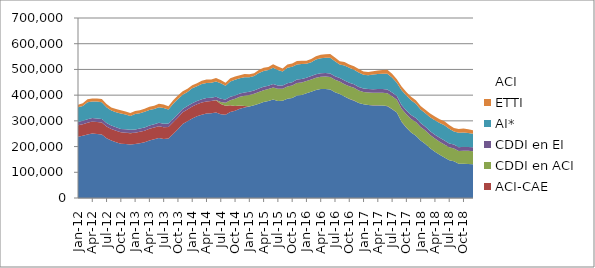
| Category | Contrat aidés hors IAE | ACI-CAE | CDDI en ACI | CDDI en EI | AI* | ETTI | ACI |
|---|---|---|---|---|---|---|---|
| 2012-01-01 | 237790 | 44843 | 7 | 13194 | 56827 | 10405 | 44850 |
| 2012-02-01 | 242077 | 45181 | 7 | 13142 | 57340 | 10618 | 45188 |
| 2012-03-01 | 246800 | 45648 | 8 | 13343 | 66093 | 11906 | 45656 |
| 2012-04-01 | 250997 | 46293 | 9 | 13502 | 64489 | 12020 | 46302 |
| 2012-05-01 | 249017 | 46345 | 11 | 13611 | 65988 | 12019 | 46356 |
| 2012-06-01 | 247269 | 46280 | 11 | 13730 | 65047 | 13131 | 46291 |
| 2012-07-01 | 232493 | 45627 | 12 | 13729 | 60846 | 13000 | 45639 |
| 2012-08-01 | 223835 | 44692 | 14 | 13555 | 58655 | 11536 | 44706 |
| 2012-09-01 | 216950 | 44370 | 17 | 13399 | 59007 | 12350 | 44387 |
| 2012-10-01 | 211000 | 44238 | 18 | 13380 | 59663 | 12602 | 44256 |
| 2012-11-01 | 209535 | 44428 | 23 | 13281 | 56994 | 12270 | 44451 |
| 2012-12-01 | 208190 | 44096 | 24 | 13060 | 53786 | 11784 | 44120 |
| 2013-01-01 | 209747 | 43795 | 34 | 12834 | 60509 | 11172 | 43829 |
| 2013-02-01 | 213206 | 44415 | 40 | 12826 | 59116 | 11595 | 44455 |
| 2013-03-01 | 216511 | 44786 | 54 | 12681 | 61223 | 12202 | 44840 |
| 2013-04-01 | 223618 | 45337 | 71 | 12829 | 60623 | 12795 | 45408 |
| 2013-05-01 | 228250 | 45591 | 82 | 12848 | 59330 | 12809 | 45673 |
| 2013-06-01 | 233109 | 46085 | 93 | 13026 | 61038 | 13410 | 46178 |
| 2013-07-01 | 229386 | 45979 | 111 | 13146 | 61170 | 14219 | 46090 |
| 2013-08-01 | 230945 | 45303 | 130 | 12918 | 54934 | 12388 | 45433 |
| 2013-09-01 | 249297 | 45329 | 171 | 12930 | 58926 | 13414 | 45500 |
| 2013-10-01 | 267700 | 45524 | 205 | 12967 | 58252 | 13732 | 45729 |
| 2013-11-01 | 287393 | 46081 | 252 | 12853 | 55422 | 12910 | 46333 |
| 2013-12-01 | 298220 | 45998 | 293 | 12821 | 55158 | 12575 | 46291 |
| 2014-01-01 | 309464 | 45928 | 308 | 12621 | 58696.797 | 11478 | 46236 |
| 2014-02-01 | 318114 | 46338 | 306 | 12626 | 57345.516 | 11258 | 46644 |
| 2014-03-01 | 324218 | 46693 | 313 | 12719 | 59389.413 | 12354 | 47006 |
| 2014-04-01 | 328255 | 47122 | 315 | 12914 | 58807.382 | 12977 | 47437 |
| 2014-05-01 | 329929 | 47121 | 302 | 12956 | 57553.107 | 12548 | 47423 |
| 2014-06-01 | 332124 | 48488 | 318 | 13239 | 59209.953 | 13420 | 48806 |
| 2014-07-01 | 325464 | 40457 | 6940 | 13160 | 59964 | 13345 | 47397 |
| 2014-08-01 | 324035 | 34754 | 11660 | 12925 | 53350 | 11352 | 46414 |
| 2014-09-01 | 334111 | 27006 | 19338 | 13025 | 59881 | 12517 | 46344 |
| 2014-10-01 | 338973 | 19225 | 27417 | 13017 | 61270 | 12452 | 46642 |
| 2014-11-01 | 346780 | 12975 | 33878 | 12914 | 58983 | 11655 | 46853 |
| 2014-12-01 | 351822 | 6151 | 39589 | 12825 | 59612 | 11767 | 45740 |
| 2015-01-01 | 356102 | 42 | 44848 | 12679 | 56326 | 10779 | 44890 |
| 2015-02-01 | 360232 | 14 | 45282 | 12631 | 55861 | 11126 | 45296 |
| 2015-03-01 | 366449 | 7 | 46062 | 12836 | 60557 | 12000 | 46069 |
| 2015-04-01 | 372869 | 4 | 46551 | 13017 | 61199 | 12554 | 46555 |
| 2015-05-01 | 376997 | 2 | 46659 | 13065 | 60705 | 12297 | 46661 |
| 2015-06-01 | 382662 | 2 | 47282 | 13391 | 62866 | 13518 | 47284 |
| 2015-07-01 | 377401 | 0 | 47007 | 13324 | 60259 | 13458 | 47007 |
| 2015-08-01 | 377988 | 0 | 46597 | 13160 | 53778 | 11609 | 46597 |
| 2015-09-01 | 385526 | 0 | 47696 | 13210 | 60301 | 12751 | 47696 |
| 2015-10-01 | 388858 | 0 | 48336 | 13149 | 59696 | 13129 | 48336 |
| 2015-11-01 | 398394 | 0 | 48919 | 13239 | 58958 | 12795 | 48919 |
| 2015-12-01 | 400899 | 0 | 48471 | 13046 | 59158 | 12273 | 48471 |
| 2016-01-01 | 407505 | 0 | 47593 | 12880 | 54191 | 11102 | 47593 |
| 2016-02-01 | 413425 | 123 | 47606 | 12906 | 54239 | 11853 | 47729 |
| 2016-03-01 | 420027 | 125 | 47900 | 13201 | 57281 | 12601 | 48025 |
| 2016-04-01 | 423598 | 123 | 48128 | 13312 | 58553 | 13016 | 48251 |
| 2016-05-01 | 424234 | 132 | 48299 | 13495 | 59216 | 13484 | 48431 |
| 2016-06-01 | 421847 | 127 | 48768 | 13784 | 60936 | 14075 | 48895 |
| 2016-07-01 | 411069 | 120 | 48513 | 13676 | 58648 | 14002 | 48633 |
| 2016-08-01 | 404758 | 113 | 47983 | 13651 | 53099 | 12513 | 48096 |
| 2016-09-01 | 394450 | 105 | 48138 | 13778 | 58580 | 13801 | 48243 |
| 2016-10-01 | 385471 | 144 | 48992 | 13832 | 57605 | 13373 | 49136 |
| 2016-11-01 | 378611 | 135 | 49686 | 13841 | 56825 | 13523 | 49821 |
| 2016-12-01 | 368962 | 41 | 48984 | 13665 | 56446 | 13239 | 49025 |
| 2017-01-01 | 364353 | 164 | 48023 | 13592 | 53622 | 11946 | 48187 |
| 2017-02-01 | 361817 | 184 | 48251 | 13711 | 53182 | 12434 | 48435 |
| 2017-03-01 | 360114 | 183 | 48826 | 13869 | 56855 | 13363 | 49009 |
| 2017-04-01 | 360068 | 184 | 49455 | 13998 | 58369 | 13649 | 49639 |
| 2017-05-01 | 359797 | 185 | 49755 | 14304 | 59572 | 14367 | 49940 |
| 2017-06-01 | 357139 | 220 | 50392 | 14575 | 60970 | 14994 | 50612 |
| 2017-07-01 | 345441 | 215 | 50430 | 14524 | 57638 | 14540 | 50645 |
| 2017-08-01 | 332067 | 212 | 49794 | 14514 | 51835 | 13053 | 50006 |
| 2017-09-01 | 295983 | 252 | 50757 | 14640 | 57781 | 14401 | 51009 |
| 2017-10-01 | 273611 | 241 | 51982 | 14924 | 57430 | 14422 | 52223 |
| 2017-11-01 | 254244 | 238 | 53195 | 15284 | 56745 | 14346 | 53433 |
| 2017-12-01 | 242066 | 132 | 53659 | 15338 | 55809 | 13561 | 53791 |
| 2018-01-01 | 223896 | 58 | 52130 | 15116 | 53308 | 12951 | 52188 |
| 2018-02-01 | 210383 | 37 | 51813 | 14900 | 52785 | 13567 | 51850 |
| 2018-03-01 | 193851 | 36 | 50999 | 14680 | 54869 | 14113 | 51035 |
| 2018-04-01 | 180261 | 35 | 50631 | 14808 | 57105 | 14401 | 50666 |
| 2018-05-01 | 168512 | 32 | 50512 | 14856 | 57582 | 14735 | 50544 |
| 2018-06-01 | 157355 | 0 | 50861 | 15099 | 59725 | 15478 | 50861 |
| 2018-07-01 | 146454 | 0 | 50523 | 15144 | 57103 | 15040 | 50523 |
| 2018-08-01 | 143218 | 0 | 49609 | 15032 | 50637 | 13503 | 49609 |
| 2018-09-01 | 132821 | 0 | 49872 | 14965 | 56005 | 14396 | 49872 |
| 2018-10-01 | 133064 | 0 | 50872 | 15205 | 55842 | 14933 | 50872 |
| 2018-11-01 | 132186 | 0 | 51364 | 15184 | 54311 | 14323 | 51364 |
| 2018-12-01 | 131440 | 0 | 50675 | 14971 | 53058 | 13625 | 50675 |